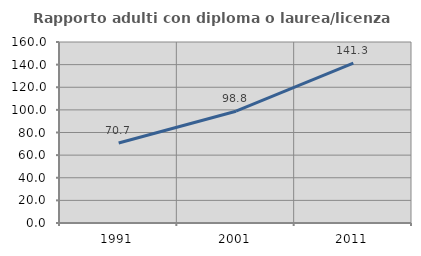
| Category | Rapporto adulti con diploma o laurea/licenza media  |
|---|---|
| 1991.0 | 70.681 |
| 2001.0 | 98.8 |
| 2011.0 | 141.27 |